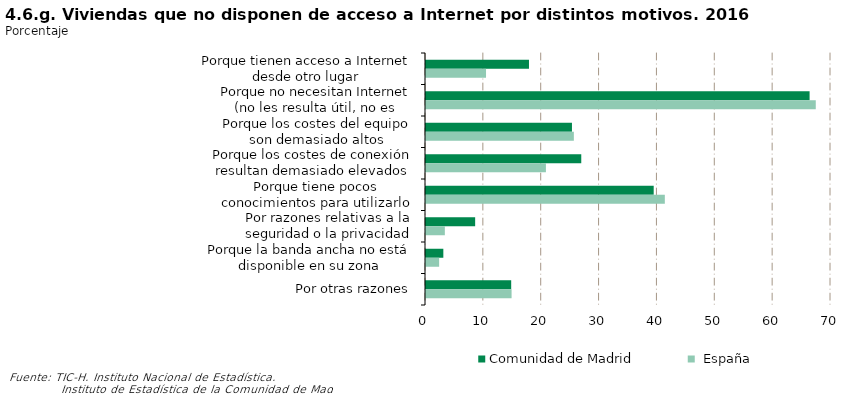
| Category | Comunidad de Madrid | España |
|---|---|---|
| Porque tienen acceso a Internet desde otro lugar | 17.799 | 10.375 |
| Porque no necesitan Internet (no les resulta útil, no es interesante, etc.) | 66.301 | 67.368 |
| Porque los costes del equipo son demasiado altos | 25.228 | 25.552 |
| Porque los costes de conexión resultan demasiado elevados (teléfono, contrato de ADSL, etc.) | 26.837 | 20.727 |
| Porque tiene pocos conocimientos para utilizarlo | 39.354 | 41.279 |
| Por razones relativas a la seguridad o la privacidad | 8.497 | 3.257 |
| Porque la banda ancha no está disponible en su zona | 2.996 | 2.272 |
| Por otras razones | 14.725 | 14.792 |